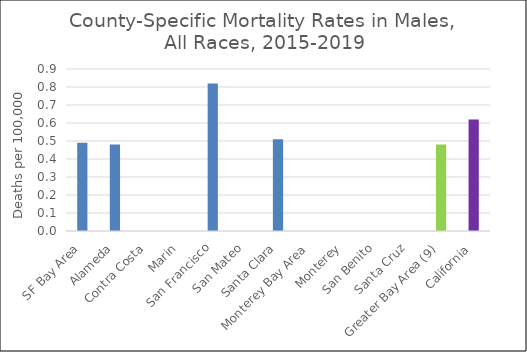
| Category | Male |
|---|---|
| SF Bay Area | 0.49 |
|   Alameda | 0.48 |
|   Contra Costa | 0 |
|   Marin | 0 |
|   San Francisco | 0.82 |
|   San Mateo | 0 |
|   Santa Clara | 0.51 |
| Monterey Bay Area | 0 |
|   Monterey | 0 |
|   San Benito | 0 |
|   Santa Cruz | 0 |
| Greater Bay Area (9) | 0.48 |
| California | 0.62 |